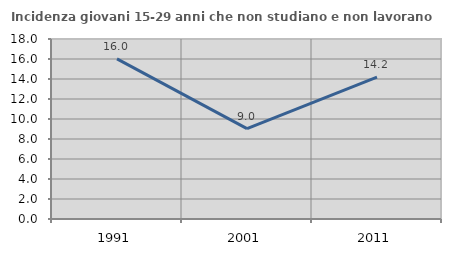
| Category | Incidenza giovani 15-29 anni che non studiano e non lavorano  |
|---|---|
| 1991.0 | 16.011 |
| 2001.0 | 9.035 |
| 2011.0 | 14.196 |